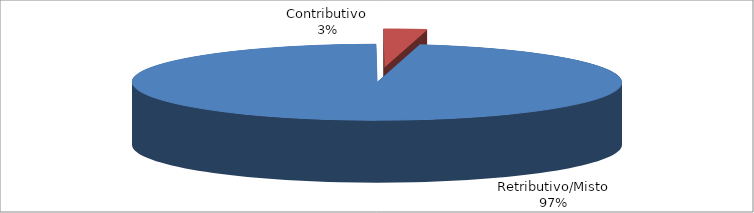
| Category | Series 1 |
|---|---|
| Retributivo/Misto | 40269 |
| Contributivo | 1180 |